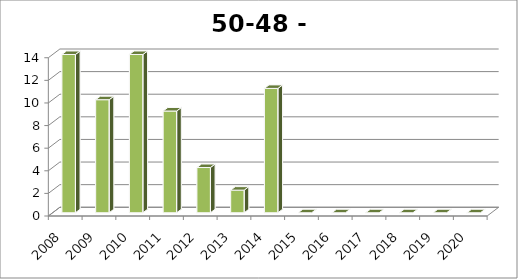
| Category | Esbeek |
|---|---|
| 2008.0 | 14 |
| 2009.0 | 10 |
| 2010.0 | 14 |
| 2011.0 | 9 |
| 2012.0 | 4 |
| 2013.0 | 2 |
| 2014.0 | 11 |
| 2015.0 | 0 |
| 2016.0 | 0 |
| 2017.0 | 0 |
| 2018.0 | 0 |
| 2019.0 | 0 |
| 2020.0 | 0 |